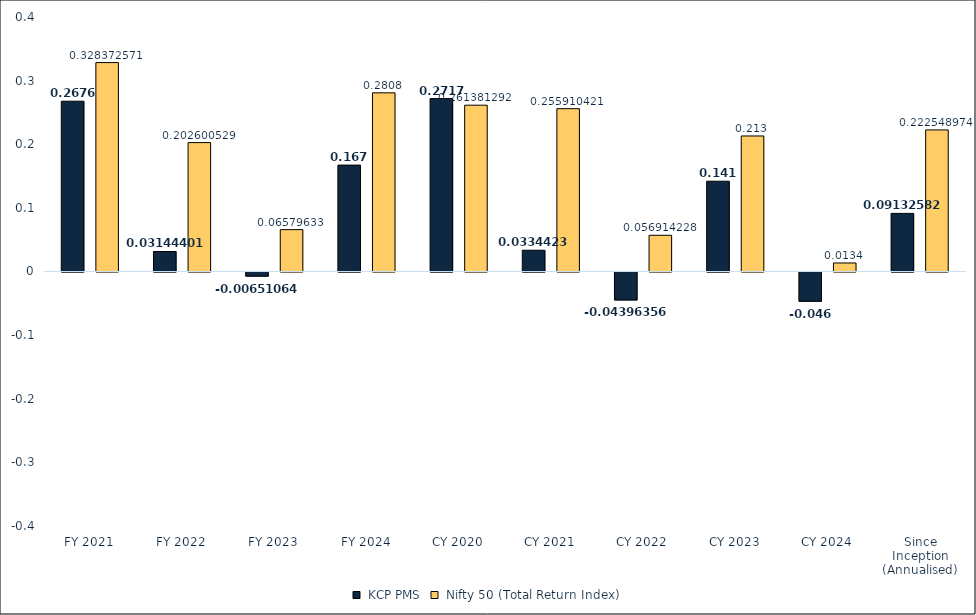
| Category | -0.04713 KCP PMS | -0.04713 Nifty 50 (Total Return Index) |
|---|---|---|
| FY 2021 | 0.268 | 0.328 |
| FY 2022 | 0.031 | 0.203 |
| FY 2023 | -0.007 | 0.066 |
| FY 2024 | 0.167 | 0.281 |
| CY 2020 | 0.272 | 0.261 |
| CY 2021 | 0.033 | 0.256 |
| CY 2022 | -0.044 | 0.057 |
| CY 2023 | 0.142 | 0.213 |
| CY 2024 | -0.046 | 0.013 |
| Since Inception (Annualised) | 0.091 | 0.223 |